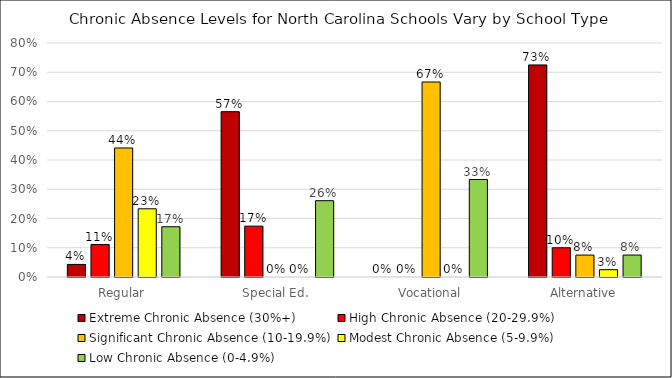
| Category | Extreme Chronic Absence (30%+) | High Chronic Absence (20-29.9%) | Significant Chronic Absence (10-19.9%) | Modest Chronic Absence (5-9.9%) | Low Chronic Absence (0-4.9%) |
|---|---|---|---|---|---|
| Regular | 0.043 | 0.111 | 0.441 | 0.233 | 0.172 |
| Special Ed. | 0.565 | 0.174 | 0 | 0 | 0.261 |
| Vocational | 0 | 0 | 0.667 | 0 | 0.333 |
| Alternative | 0.725 | 0.1 | 0.075 | 0.025 | 0.075 |